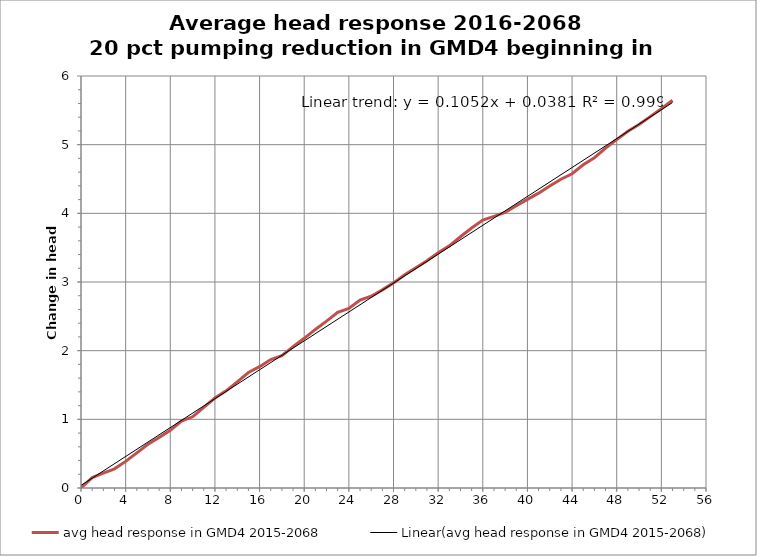
| Category | avg head response in GMD4 2015-2068 |
|---|---|
| 0.0 | 0 |
| 1.0 | 0.151 |
| 2.0 | 0.216 |
| 3.0 | 0.279 |
| 4.0 | 0.387 |
| 5.0 | 0.512 |
| 6.0 | 0.637 |
| 7.0 | 0.735 |
| 8.0 | 0.842 |
| 9.0 | 0.974 |
| 10.0 | 1.037 |
| 11.0 | 1.174 |
| 12.0 | 1.311 |
| 13.0 | 1.415 |
| 14.0 | 1.545 |
| 15.0 | 1.682 |
| 16.0 | 1.767 |
| 17.0 | 1.871 |
| 18.0 | 1.929 |
| 19.0 | 2.059 |
| 20.0 | 2.18 |
| 21.0 | 2.309 |
| 22.0 | 2.431 |
| 23.0 | 2.56 |
| 24.0 | 2.616 |
| 25.0 | 2.737 |
| 26.0 | 2.793 |
| 27.0 | 2.886 |
| 28.0 | 2.987 |
| 29.0 | 3.106 |
| 30.0 | 3.208 |
| 31.0 | 3.309 |
| 32.0 | 3.426 |
| 33.0 | 3.526 |
| 34.0 | 3.659 |
| 35.0 | 3.786 |
| 36.0 | 3.902 |
| 37.0 | 3.956 |
| 38.0 | 4.012 |
| 39.0 | 4.111 |
| 40.0 | 4.204 |
| 41.0 | 4.294 |
| 42.0 | 4.398 |
| 43.0 | 4.497 |
| 44.0 | 4.576 |
| 45.0 | 4.706 |
| 46.0 | 4.81 |
| 47.0 | 4.949 |
| 48.0 | 5.073 |
| 49.0 | 5.196 |
| 50.0 | 5.293 |
| 51.0 | 5.408 |
| 52.0 | 5.524 |
| 53.0 | 5.647 |